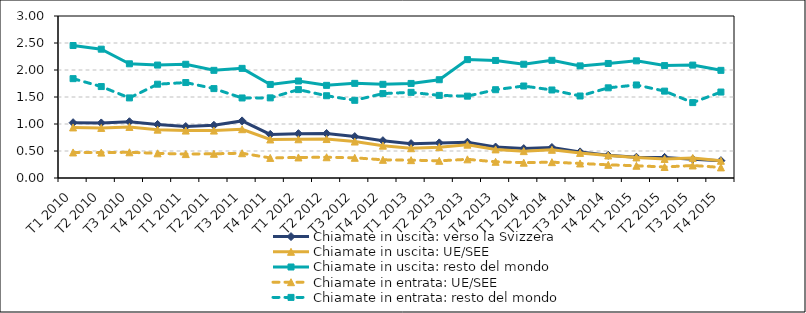
| Category | Chiamate in uscita: verso la Svizzera | Chiamate in uscita: UE/SEE | Chiamate in uscita: resto del mondo | Chiamate in entrata: UE/SEE | Chiamate in entrata: resto del mondo |
|---|---|---|---|---|---|
| T1 2010 | 1.024 | 0.937 | 2.453 | 0.473 | 1.84 |
| T2 2010 | 1.02 | 0.927 | 2.385 | 0.47 | 1.693 |
| T3 2010 | 1.042 | 0.946 | 2.115 | 0.476 | 1.483 |
| T4 2010 | 0.992 | 0.896 | 2.091 | 0.457 | 1.737 |
| T1 2011 | 0.953 | 0.878 | 2.106 | 0.443 | 1.768 |
| T2 2011 | 0.976 | 0.878 | 1.994 | 0.449 | 1.656 |
| T3 2011 | 1.058 | 0.903 | 2.03 | 0.459 | 1.482 |
| T4 2011 | 0.808 | 0.713 | 1.733 | 0.372 | 1.484 |
| T1 2012 | 0.821 | 0.717 | 1.796 | 0.381 | 1.637 |
| T2 2012 | 0.824 | 0.721 | 1.716 | 0.384 | 1.523 |
| T3 2012 | 0.767 | 0.675 | 1.753 | 0.374 | 1.439 |
| T4 2012 | 0.691 | 0.599 | 1.735 | 0.336 | 1.563 |
| T1 2013 | 0.637 | 0.551 | 1.751 | 0.331 | 1.586 |
| T2 2013 | 0.65 | 0.571 | 1.82 | 0.318 | 1.53 |
| T3 2013 | 0.662 | 0.618 | 2.192 | 0.346 | 1.516 |
| T4 2013 | 0.573 | 0.53 | 2.177 | 0.3 | 1.635 |
| T1 2014 | 0.544 | 0.498 | 2.107 | 0.284 | 1.704 |
| T2 2014 | 0.565 | 0.522 | 2.179 | 0.293 | 1.63 |
| T3 2014 | 0.484 | 0.465 | 2.076 | 0.269 | 1.519 |
| T4 2014 | 0.421 | 0.418 | 2.121 | 0.244 | 1.67 |
| T1 2015 | 0.385 | 0.382 | 2.17 | 0.227 | 1.723 |
| T2 2015 | 0.382 | 0.354 | 2.082 | 0.204 | 1.609 |
| T3 2015 | 0.349 | 0.372 | 2.091 | 0.232 | 1.396 |
| T4 2015 | 0.321 | 0.319 | 1.994 | 0.196 | 1.592 |